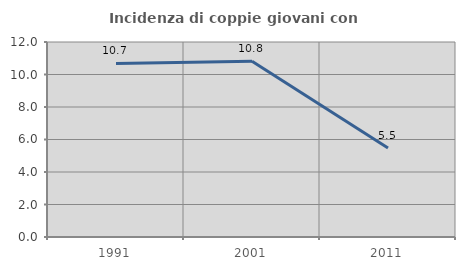
| Category | Incidenza di coppie giovani con figli |
|---|---|
| 1991.0 | 10.68 |
| 2001.0 | 10.811 |
| 2011.0 | 5.479 |